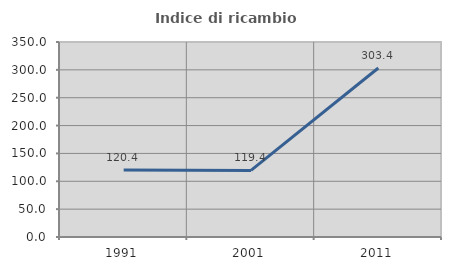
| Category | Indice di ricambio occupazionale  |
|---|---|
| 1991.0 | 120.37 |
| 2001.0 | 119.444 |
| 2011.0 | 303.39 |